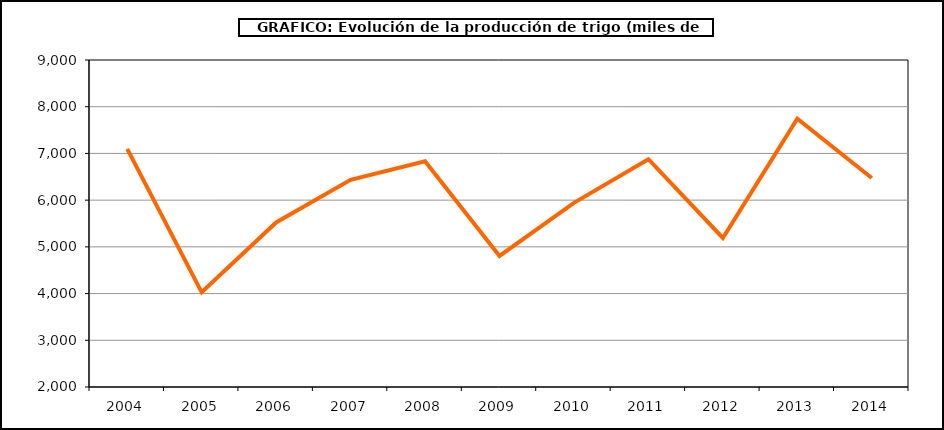
| Category | Producción |
|---|---|
| 2004.0 | 7096.724 |
| 2005.0 | 4026.694 |
| 2006.0 | 5521.582 |
| 2007.0 | 6436.359 |
| 2008.0 | 6831.461 |
| 2009.0 | 4804.772 |
| 2010.0 | 5941.197 |
| 2011.0 | 6876.651 |
| 2012.0 | 5189.828 |
| 2013.0 | 7744.928 |
| 2014.0 | 6472.734 |